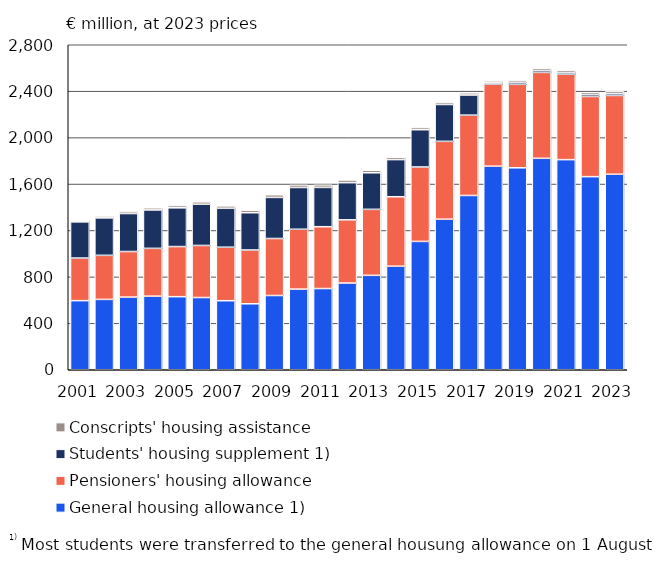
| Category | General housing allowance 1) | Pensioners' housing allowance | Students' housing supplement 1) | Conscripts' housing assistance |
|---|---|---|---|---|
| 2001.0 | 595.479 | 366.764 | 311.961 | 13.866 |
| 2002.0 | 606.242 | 379.663 | 322.622 | 15.718 |
| 2003.0 | 626.182 | 392.523 | 327.294 | 16.453 |
| 2004.0 | 634.133 | 411.809 | 330.935 | 18.308 |
| 2005.0 | 629.631 | 431.796 | 333.822 | 19.309 |
| 2006.0 | 622.233 | 448.702 | 354.835 | 20.957 |
| 2007.0 | 594.811 | 461.102 | 335.127 | 20.715 |
| 2008.0 | 568.394 | 463.468 | 321.028 | 21.896 |
| 2009.0 | 639.76 | 491.136 | 353.831 | 22.864 |
| 2010.0 | 694.922 | 515.577 | 359.686 | 22.051 |
| 2011.0 | 699.84 | 532.431 | 338.568 | 22.122 |
| 2012.0 | 747.186 | 544.406 | 320.235 | 23.057 |
| 2013.0 | 813.443 | 568.644 | 314.964 | 21.469 |
| 2014.0 | 892.244 | 598.443 | 319.77 | 19.838 |
| 2015.0 | 1105.732 | 641.245 | 321.077 | 18.723 |
| 2016.0 | 1297.156 | 670.766 | 317.489 | 17.888 |
| 2017.0 | 1501.613 | 692.007 | 173.433 | 18.52 |
| 2018.0 | 1753.971 | 706.93 | 10.896 | 16.433 |
| 2019.0 | 1739.939 | 719.105 | 15.743 | 17.318 |
| 2020.0 | 1821.816 | 739.935 | 16.154 | 18.608 |
| 2021.0 | 1810.296 | 736.218 | 14.168 | 19.005 |
| 2022.0 | 1663.606 | 691.194 | 16.668 | 19.453 |
| 2023.0 | 1684.21 | 679.21 | 15.62 | 19.46 |